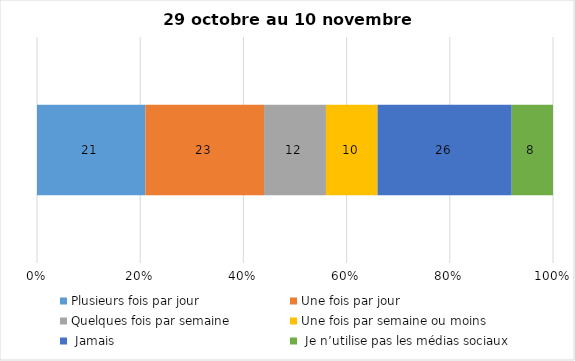
| Category | Plusieurs fois par jour | Une fois par jour | Quelques fois par semaine   | Une fois par semaine ou moins   |  Jamais   |  Je n’utilise pas les médias sociaux |
|---|---|---|---|---|---|---|
| 0 | 21 | 23 | 12 | 10 | 26 | 8 |